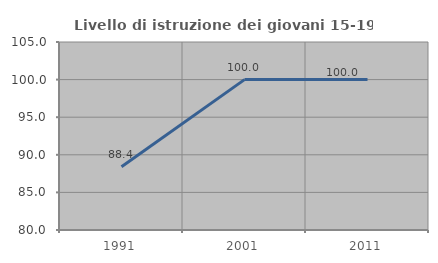
| Category | Livello di istruzione dei giovani 15-19 anni |
|---|---|
| 1991.0 | 88.421 |
| 2001.0 | 100 |
| 2011.0 | 100 |